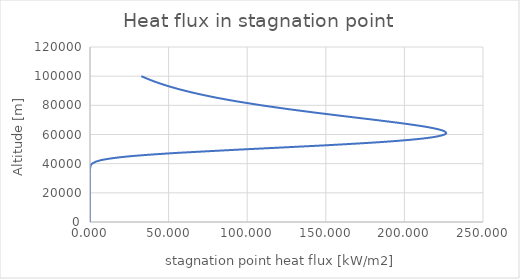
| Category | Series 0 |
|---|---|
| 32.648614024842054 | 100000 |
| 38.11623061006752 | 97500 |
| 44.47645395199296 | 95000 |
| 51.86123334271082 | 92500 |
| 60.41366662975517 | 90000 |
| 70.28344202626063 | 87500 |
| 81.61792797494076 | 85000 |
| 94.54634650925193 | 82500 |
| 109.15329060743021 | 80000 |
| 125.43641109111212 | 77500 |
| 143.24170910972606 | 75000 |
| 162.1694282194853 | 72500 |
| 181.4461585208772 | 70000 |
| 199.76868241280454 | 67500 |
| 215.14948344966393 | 65000 |
| 224.8417971668787 | 62500 |
| 225.49701300194846 | 60000 |
| 213.7839276227815 | 57500 |
| 187.68007124891287 | 55000 |
| 148.3272608487639 | 52500 |
| 101.54087756457645 | 50000 |
| 57.12070502412421 | 47500 |
| 24.569687913269043 | 45000 |
| 7.323276855329881 | 42500 |
| 1.3221283423564603 | 40000 |
| 0.12029004734160628 | 37500 |
| 0.004289417221935201 | 35000 |
| 4.2516187894283666e-05 | 32500 |
| 7.323712199473316e-08 | 30000 |
| 1.1538251134761924e-11 | 27500 |
| 6.913864613670294e-17 | 25000 |
| 4.749273725463343e-24 | 22500 |
| 7.260155446817317e-34 | 20000 |
| 2.6278903994938876e-47 | 17500 |
| 1.0533737589652183e-65 | 15000 |
| 7.111119567199871e-91 | 12500 |
| 2.6476036914257266e-125 | 10000 |
| 2.18263059558019e-172 | 7500 |
| 9.079532432599851e-237 | 5000 |
| 0.0 | 2500 |
| 0.0 | 0 |